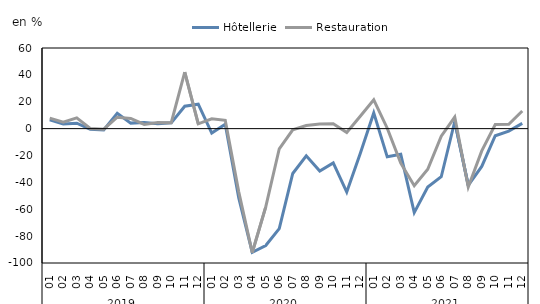
| Category | Hôtellerie | Restauration |
|---|---|---|
| 0 | 6.5 | 7.8 |
| 1 | 3.4 | 4.8 |
| 2 | 4 | 8 |
| 3 | -0.4 | 0.1 |
| 4 | -1 | -0.4 |
| 5 | 11.4 | 8.5 |
| 6 | 4.1 | 7.6 |
| 7 | 4.5 | 3.1 |
| 8 | 3.6 | 4.6 |
| 9 | 4.3 | 4.4 |
| 10 | 16.7 | 42.1 |
| 11 | 18.2 | 3.6 |
| 12 | -3.3 | 7.3 |
| 13 | 3.3 | 6.2 |
| 14 | -51.5 | -47 |
| 15 | -92 | -92.3 |
| 16 | -87 | -58.2 |
| 17 | -74.4 | -15 |
| 18 | -33.4 | -0.9 |
| 19 | -20.2 | 2.3 |
| 20 | -31.6 | 3.4 |
| 21 | -25.5 | 3.7 |
| 22 | -47.2 | -2.9 |
| 23 | -18.6 | 9.2 |
| 24 | 11.7 | 21.5 |
| 25 | -21 | 0.3 |
| 26 | -19 | -25.7 |
| 27 | -62.5 | -42.5 |
| 28 | -43.5 | -30.2 |
| 29 | -35.8 | -5.6 |
| 30 | 5.3 | 8.6 |
| 31 | -42.2 | -43.4 |
| 32 | -28.1 | -16.6 |
| 33 | -5.3 | 3.1 |
| 34 | -1.8 | 3.2 |
| 35 | 3.9 | 13.1 |